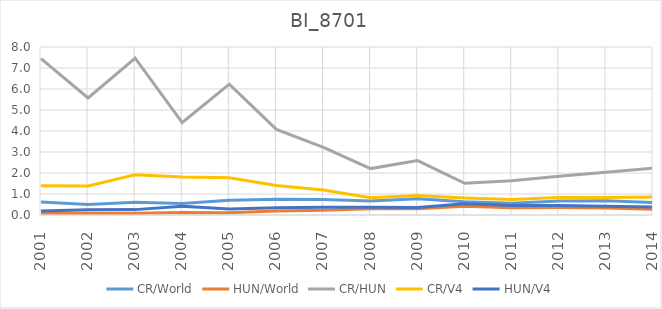
| Category | CR/World | HUN/World | CR/HUN | CR/V4 | HUN/V4 |
|---|---|---|---|---|---|
| 2001.0 | 0.615 | 0.083 | 7.448 | 1.396 | 0.187 |
| 2002.0 | 0.494 | 0.089 | 5.575 | 1.381 | 0.248 |
| 2003.0 | 0.606 | 0.081 | 7.472 | 1.913 | 0.256 |
| 2004.0 | 0.545 | 0.124 | 4.403 | 1.814 | 0.412 |
| 2005.0 | 0.697 | 0.112 | 6.231 | 1.773 | 0.285 |
| 2006.0 | 0.755 | 0.185 | 4.075 | 1.405 | 0.345 |
| 2007.0 | 0.735 | 0.228 | 3.218 | 1.192 | 0.37 |
| 2008.0 | 0.667 | 0.302 | 2.211 | 0.82 | 0.371 |
| 2009.0 | 0.771 | 0.298 | 2.59 | 0.93 | 0.359 |
| 2010.0 | 0.635 | 0.42 | 1.513 | 0.814 | 0.538 |
| 2011.0 | 0.562 | 0.346 | 1.626 | 0.739 | 0.455 |
| 2012.0 | 0.666 | 0.362 | 1.841 | 0.827 | 0.45 |
| 2013.0 | 0.676 | 0.332 | 2.037 | 0.838 | 0.411 |
| 2014.0 | 0.596 | 0.268 | 2.226 | 0.853 | 0.383 |